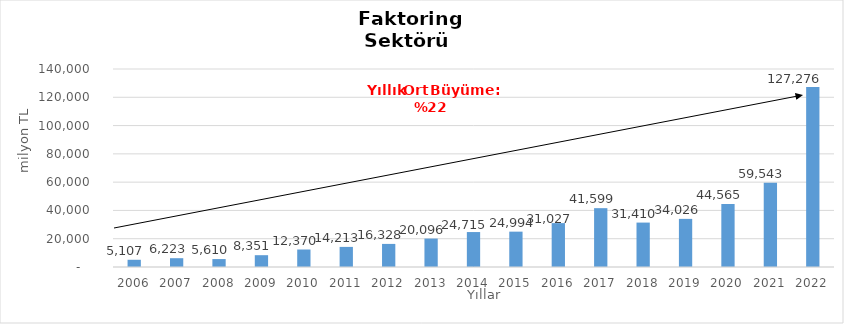
| Category | Faktoring  |
|---|---|
| 2006.0 | 5107.149 |
| 2007.0 | 6222.508 |
| 2008.0 | 5610.293 |
| 2009.0 | 8350.82 |
| 2010.0 | 12369.836 |
| 2011.0 | 14213.285 |
| 2012.0 | 16327.829 |
| 2013.0 | 20095.909 |
| 2014.0 | 24715 |
| 2015.0 | 24994 |
| 2016.0 | 31027 |
| 2017.0 | 41599 |
| 2018.0 | 31410 |
| 2019.0 | 34026 |
| 2020.0 | 44565 |
| 2021.0 | 59543 |
| 2022.0 | 127276 |